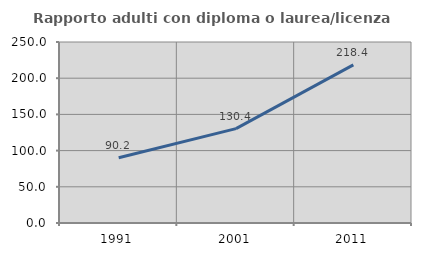
| Category | Rapporto adulti con diploma o laurea/licenza media  |
|---|---|
| 1991.0 | 90.196 |
| 2001.0 | 130.357 |
| 2011.0 | 218.367 |